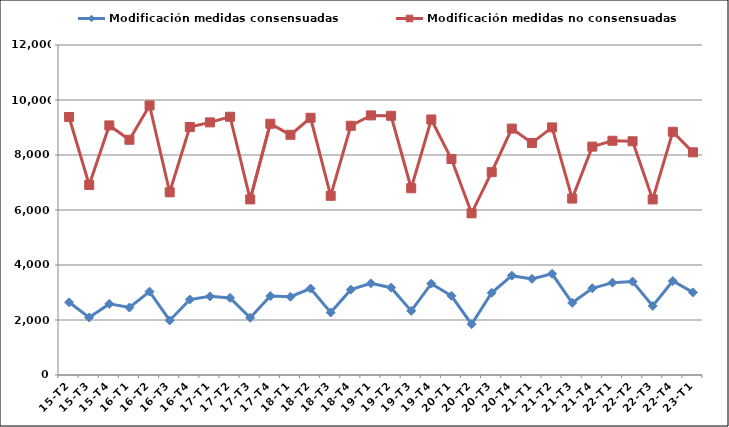
| Category | Modificación medidas consensuadas | Modificación medidas no consensuadas |
|---|---|---|
| 15-T2 | 2644 | 9382 |
| 15-T3 | 2092 | 6911 |
| 15-T4 | 2586 | 9076 |
| 16-T1 | 2455 | 8554 |
| 16-T2 | 3032 | 9802 |
| 16-T3 | 1983 | 6644 |
| 16-T4 | 2744 | 9017 |
| 17-T1 | 2859 | 9186 |
| 17-T2 | 2804 | 9391 |
| 17-T3 | 2082 | 6385 |
| 17-T4 | 2872 | 9137 |
| 18-T1 | 2846 | 8734 |
| 18-T2 | 3144 | 9353 |
| 18-T3 | 2272 | 6516 |
| 18-T4 | 3104 | 9063 |
| 19-T1 | 3335 | 9440 |
| 19-T2 | 3176 | 9426 |
| 19-T3 | 2332 | 6792 |
| 19-T4 | 3323 | 9291 |
| 20-T1 | 2880 | 7854 |
| 20-T2 | 1846 | 5880 |
| 20-T3 | 2991 | 7376 |
| 20-T4 | 3612 | 8960 |
| 21-T1 | 3496 | 8439 |
| 21-T2 | 3680 | 9003 |
| 21-T3 | 2625 | 6416 |
| 21-T4 | 3154 | 8304 |
| 22-T1 | 3359 | 8518 |
| 22-T2 | 3398 | 8500 |
| 22-T3 | 2512 | 6384 |
| 22-T4 | 3417 | 8845 |
| 23-T1 | 3003 | 8097 |